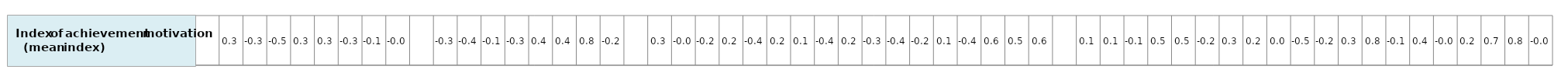
| Category | I want top grades in most or all of my courses |
|---|---|
| nan | 1 |
| 0.3313878125275609 | 1 |
| -0.2558469189301774 | 1 |
| -0.4533059617675153 | 1 |
| 0.3276094519753038 | 1 |
| 0.293408572238441 | 1 |
| -0.2772737681461361 | 1 |
| -0.1489642556819538 | 1 |
| -0.0367076761255364 | 1 |
| -0.6262125090268778 | 1 |
| -0.2533078608902807 | 1 |
| -0.3801218072599032 | 1 |
| -0.0999734201435925 | 1 |
| -0.2990668474320471 | 1 |
| 0.3863137761482443 | 1 |
| 0.394520846933257 | 1 |
| 0.8318543190681789 | 1 |
| -0.1707823863636322 | 1 |
| -0.5134002296936501 | 1 |
| 0.3375859857411192 | 1 |
| -0.0305298153130235 | 1 |
| -0.1714428814574347 | 1 |
| 0.2468566609689811 | 1 |
| -0.4362660288392463 | 1 |
| 0.2414706432107629 | 1 |
| 0.1021126769920752 | 1 |
| -0.4204585632814734 | 1 |
| 0.2018536527561898 | 1 |
| -0.2846645538297939 | 1 |
| -0.4309451803514304 | 1 |
| -0.1596901528474856 | 1 |
| 0.1481806960122158 | 1 |
| -0.432755838447096 | 1 |
| 0.6188307871417776 | 1 |
| 0.5137685941583314 | 1 |
| 0.6482523194607845 | 1 |
| nan | 1 |
| 0.1237336541238096 | 1 |
| 0.1123460778762985 | 1 |
| -0.0563838210204997 | 1 |
| 0.5004228922386823 | 1 |
| 0.5075499317394667 | 1 |
| -0.241165586892888 | 1 |
| 0.3365118856166815 | 1 |
| 0.1962672416910857 | 1 |
| 0.0021869916450653 | 1 |
| -0.4971314856001082 | 1 |
| -0.1588862905987277 | 1 |
| 0.3362778176652177 | 1 |
| 0.7692328673769415 | 1 |
| -0.0896971684879251 | 1 |
| 0.4144187012117057 | 1 |
| -0.0086118987850488 | 1 |
| 0.2370681158165773 | 1 |
| 0.6651475670410297 | 1 |
| 0.7791519357437909 | 1 |
| -0.0493055532455163 | 1 |